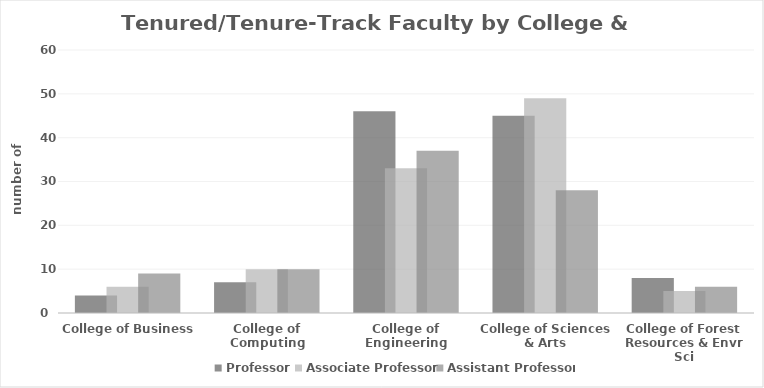
| Category | Professor  | Associate Professor  | Assistant Professor  |
|---|---|---|---|
| College of Business | 4 | 6 | 9 |
| College of Computing | 7 | 10 | 10 |
| College of Engineering | 46 | 33 | 37 |
| College of Sciences & Arts | 45 | 49 | 28 |
| College of Forest Resources & Envr Sci | 8 | 5 | 6 |